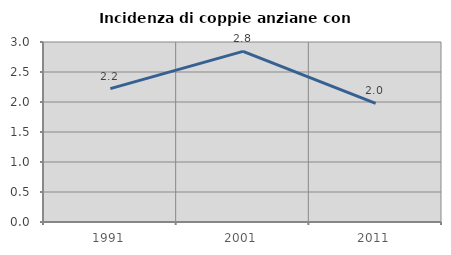
| Category | Incidenza di coppie anziane con figli |
|---|---|
| 1991.0 | 2.222 |
| 2001.0 | 2.844 |
| 2011.0 | 1.978 |